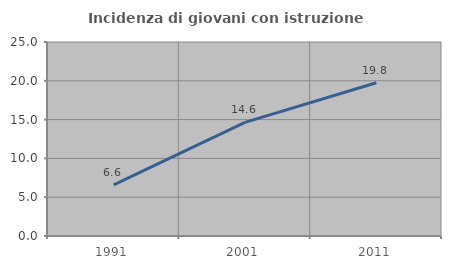
| Category | Incidenza di giovani con istruzione universitaria |
|---|---|
| 1991.0 | 6.579 |
| 2001.0 | 14.634 |
| 2011.0 | 19.753 |